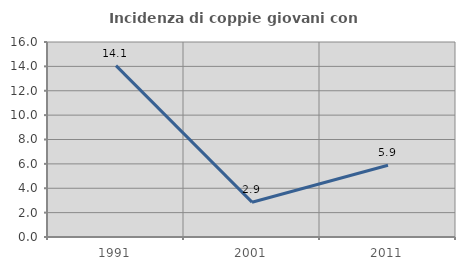
| Category | Incidenza di coppie giovani con figli |
|---|---|
| 1991.0 | 14.062 |
| 2001.0 | 2.857 |
| 2011.0 | 5.882 |